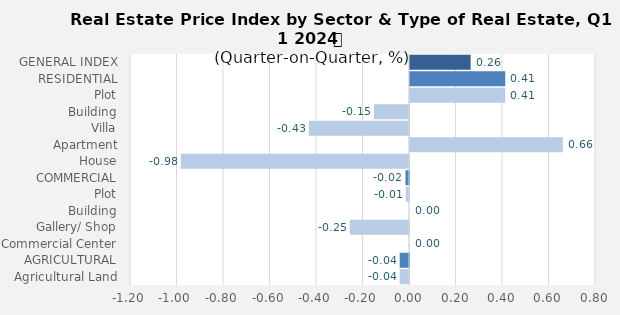
| Category | Q4-2023 |
|---|---|
| GENERAL INDEX | 0.261 |
| RESIDENTIAL | 0.41 |
| Plot | 0.41 |
| Building | -0.151 |
| Villa | -0.431 |
| Apartment | 0.658 |
| House | -0.981 |
| COMMERCIAL | -0.015 |
| Plot | -0.014 |
| Building | 0 |
| Gallery/ Shop | -0.255 |
| Commercial Center | 0 |
| AGRICULTURAL | -0.04 |
| Agricultural Land | -0.04 |